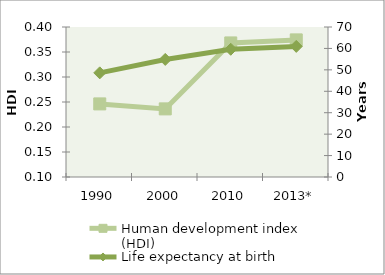
| Category | Human development index (HDI) |
|---|---|
| 1990 | 0.246 |
| 2000 | 0.236 |
| 2010 | 0.368 |
| 2013* | 0.374 |